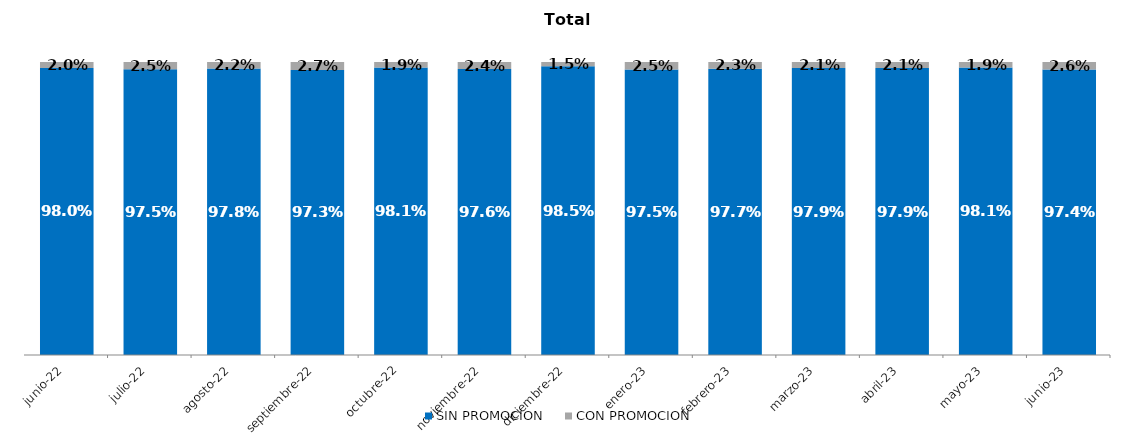
| Category | SIN PROMOCION   | CON PROMOCION   |
|---|---|---|
| 2022-06-01 | 0.98 | 0.02 |
| 2022-07-01 | 0.975 | 0.025 |
| 2022-08-01 | 0.978 | 0.022 |
| 2022-09-01 | 0.973 | 0.027 |
| 2022-10-01 | 0.981 | 0.019 |
| 2022-11-01 | 0.976 | 0.024 |
| 2022-12-01 | 0.985 | 0.015 |
| 2023-01-01 | 0.975 | 0.025 |
| 2023-02-01 | 0.977 | 0.023 |
| 2023-03-01 | 0.979 | 0.021 |
| 2023-04-01 | 0.979 | 0.021 |
| 2023-05-01 | 0.981 | 0.019 |
| 2023-06-01 | 0.974 | 0.026 |